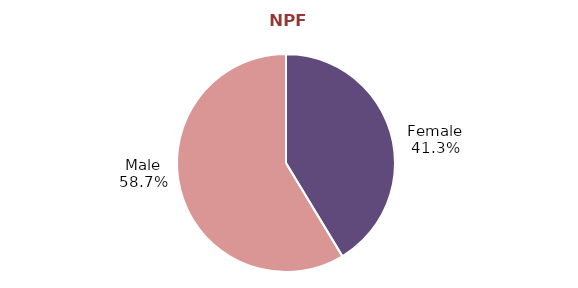
| Category | Series 0 |
|---|---|
| Female | 277785 |
| Male | 394080 |